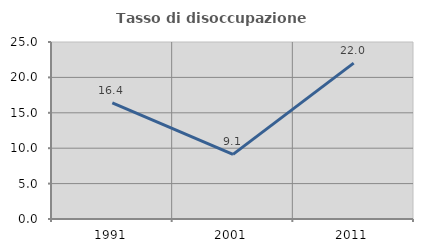
| Category | Tasso di disoccupazione giovanile  |
|---|---|
| 1991.0 | 16.387 |
| 2001.0 | 9.129 |
| 2011.0 | 22.013 |